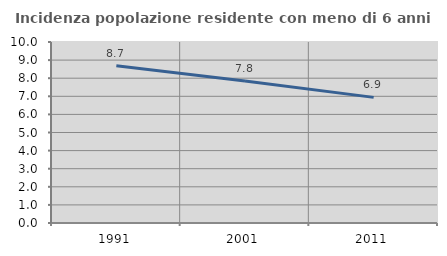
| Category | Incidenza popolazione residente con meno di 6 anni |
|---|---|
| 1991.0 | 8.683 |
| 2001.0 | 7.847 |
| 2011.0 | 6.94 |